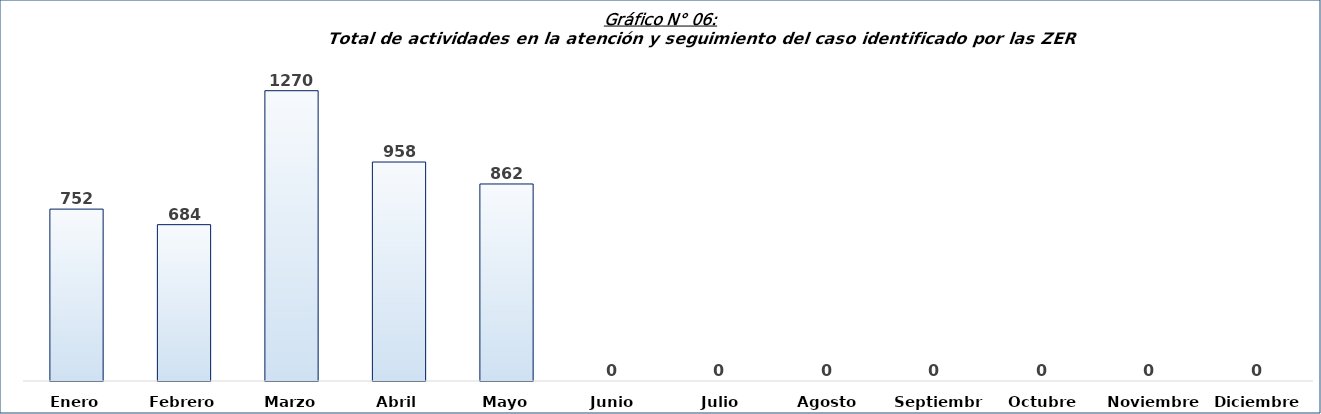
| Category | Total Acciones |
|---|---|
| Enero | 752 |
| Febrero | 684 |
| Marzo | 1270 |
| Abril | 958 |
| Mayo | 862 |
| Junio | 0 |
| Julio | 0 |
| Agosto | 0 |
| Septiembre | 0 |
| Octubre | 0 |
| Noviembre | 0 |
| Diciembre | 0 |